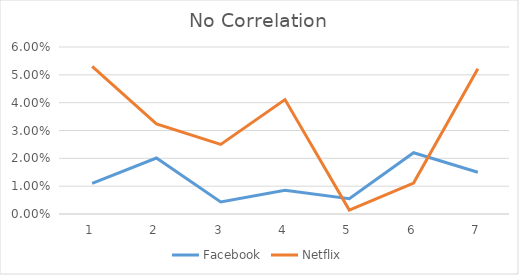
| Category | Facebook | Netflix |
|---|---|---|
| 0 | 0.011 | 0.053 |
| 1 | 0.02 | 0.032 |
| 2 | 0.004 | 0.025 |
| 3 | 0.008 | 0.041 |
| 4 | 0.006 | 0.001 |
| 5 | 0.022 | 0.011 |
| 6 | 0.015 | 0.052 |